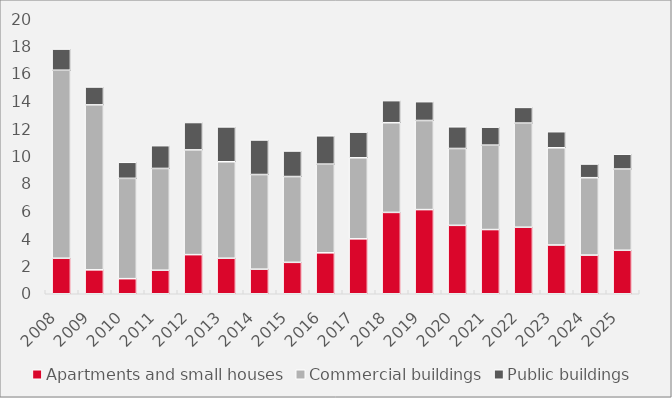
| Category | Apartments and small houses | Commercial buildings | Public buildings |
|---|---|---|---|
| 2008.0 | 2.583 | 13.675 | 1.537 |
| 2009.0 | 1.739 | 11.998 | 1.299 |
| 2010.0 | 1.097 | 7.295 | 1.167 |
| 2011.0 | 1.711 | 7.402 | 1.657 |
| 2012.0 | 2.845 | 7.618 | 1.991 |
| 2013.0 | 2.583 | 7.017 | 2.534 |
| 2014.0 | 1.786 | 6.885 | 2.513 |
| 2015.0 | 2.285 | 6.24 | 1.857 |
| 2016.0 | 2.978 | 6.45 | 2.061 |
| 2017.0 | 3.994 | 5.894 | 1.867 |
| 2018.0 | 5.917 | 6.523 | 1.605 |
| 2019.0 | 6.12 | 6.481 | 1.369 |
| 2020.0 | 4.976 | 5.589 | 1.578 |
| 2021.0 | 4.669 | 6.14 | 1.309 |
| 2022.0 | 4.838 | 7.573 | 1.141 |
| 2023.0 | 3.546 | 7.07 | 1.169 |
| 2024.0 | 2.812 | 5.628 | 0.995 |
| 2025.0 | 3.162 | 5.908 | 1.08 |